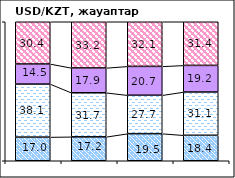
| Category | повысится | не изменится | снизится | не знаю |
|---|---|---|---|---|
| 0 | 17.02 | 38.14 | 14.47 | 30.37 |
| 1 | 17.21 | 31.71 | 17.87 | 33.21 |
| 2 | 19.49 | 27.67 | 20.74 | 32.1 |
| 3 | 18.35 | 31.1 | 19.16 | 31.39 |